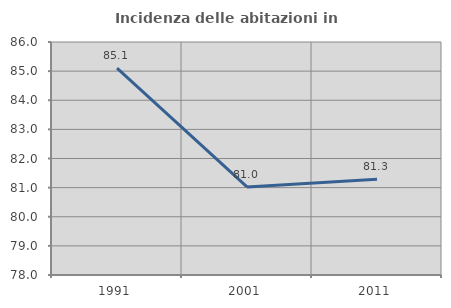
| Category | Incidenza delle abitazioni in proprietà  |
|---|---|
| 1991.0 | 85.106 |
| 2001.0 | 81.023 |
| 2011.0 | 81.29 |